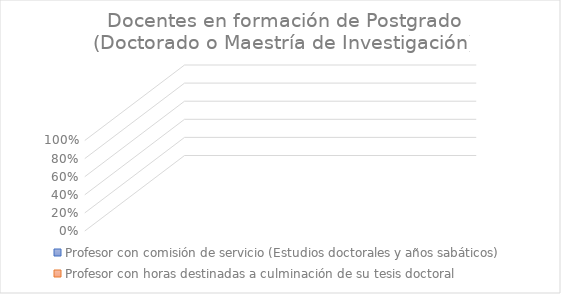
| Category | Profesor con comisión de servicio (Estudios doctorales y años sabáticos) | Profesor con horas destinadas a culminación de su tesis doctoral |
|---|---|---|
| 0 | 0 | 0 |